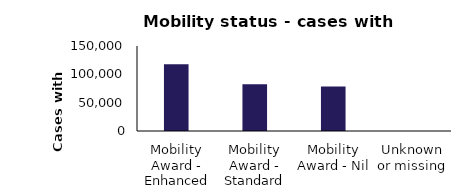
| Category | Series 0 |
|---|---|
| Mobility Award - Enhanced | 117862 |
| Mobility Award - Standard | 82654 |
| Mobility Award - Nil | 78526 |
| Unknown or missing | 17 |